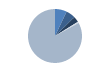
| Category | Series 0 |
|---|---|
| ARRASTRE | 35 |
| CERCO | 28 |
| PALANGRE | 17 |
| REDES DE ENMALLE | 4 |
| ARTES MENORES | 411 |
| SIN TIPO ASIGNADO | 0 |